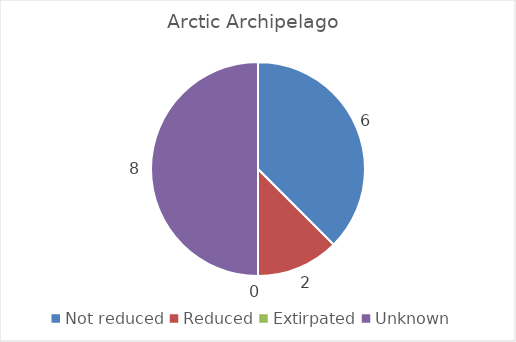
| Category | Arctic Archipelago |
|---|---|
| Not reduced | 6 |
| Reduced | 2 |
| Extirpated | 0 |
| Unknown | 8 |